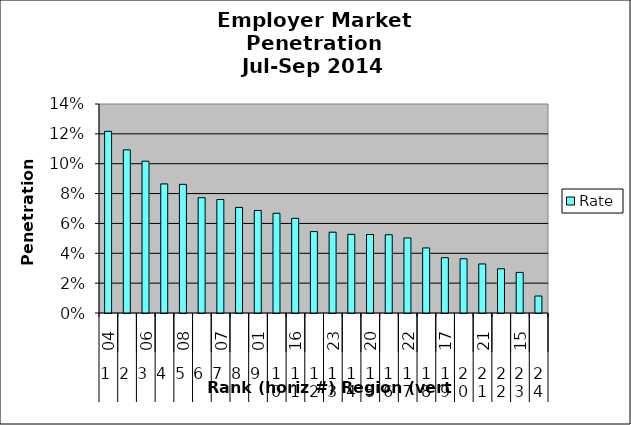
| Category | Rate |
|---|---|
| 0 | 0.122 |
| 1 | 0.109 |
| 2 | 0.102 |
| 3 | 0.086 |
| 4 | 0.086 |
| 5 | 0.077 |
| 6 | 0.076 |
| 7 | 0.071 |
| 8 | 0.069 |
| 9 | 0.067 |
| 10 | 0.063 |
| 11 | 0.055 |
| 12 | 0.054 |
| 13 | 0.053 |
| 14 | 0.053 |
| 15 | 0.052 |
| 16 | 0.05 |
| 17 | 0.044 |
| 18 | 0.037 |
| 19 | 0.036 |
| 20 | 0.033 |
| 21 | 0.03 |
| 22 | 0.027 |
| 23 | 0.011 |